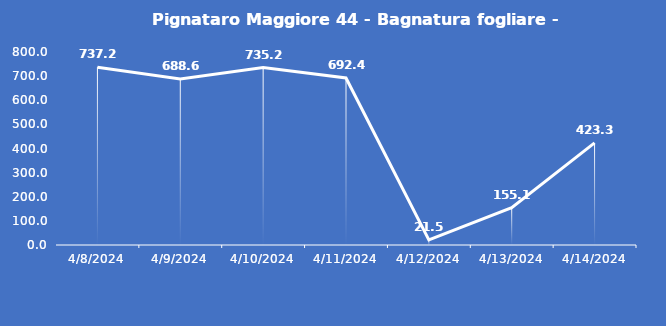
| Category | Pignataro Maggiore 44 - Bagnatura fogliare - Grezzo (min) |
|---|---|
| 4/8/24 | 737.2 |
| 4/9/24 | 688.6 |
| 4/10/24 | 735.2 |
| 4/11/24 | 692.4 |
| 4/12/24 | 21.5 |
| 4/13/24 | 155.1 |
| 4/14/24 | 423.3 |